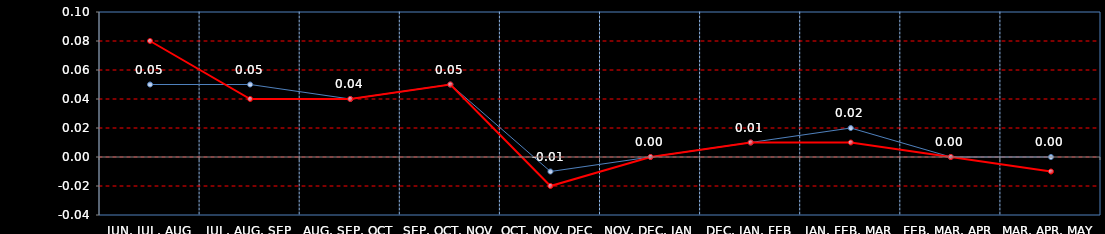
| Category | Last | Settlement | First MA | Second MA | Third MA |
|---|---|---|---|---|---|
| JUN, JUL, AUG | 0.05 | 0.08 |  |  |  |
| JUL, AUG, SEP | 0.05 | 0.04 |  |  |  |
| AUG, SEP, OCT | 0.04 | 0.04 |  |  |  |
| SEP, OCT, NOV | 0.05 | 0.05 |  |  |  |
| OCT, NOV, DEC | -0.01 | -0.02 |  |  |  |
| NOV, DEC, JAN | 0 | 0 |  |  |  |
| DEC, JAN, FEB | 0.01 | 0.01 |  |  |  |
| JAN, FEB, MAR | 0.02 | 0.01 |  |  |  |
| FEB, MAR, APR | 0 | 0 |  |  |  |
| MAR, APR, MAY | 0 | -0.01 |  |  |  |